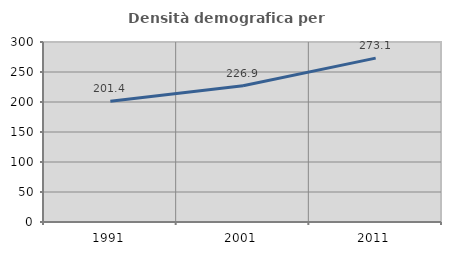
| Category | Densità demografica |
|---|---|
| 1991.0 | 201.405 |
| 2001.0 | 226.942 |
| 2011.0 | 273.109 |